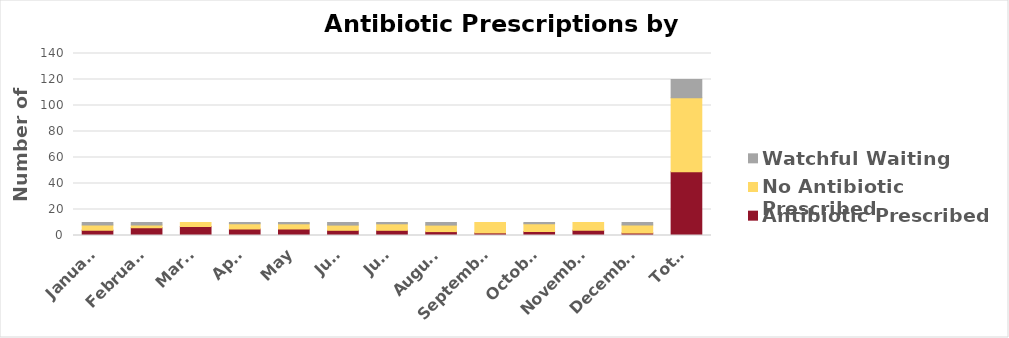
| Category | Antibiotic Prescribed | No Antibiotic Prescribed | Watchful Waiting |
|---|---|---|---|
| January | 4 | 4 | 2 |
| February | 6 | 2 | 2 |
| March | 7 | 3 | 0 |
| April | 5 | 4 | 1 |
| May | 5 | 4 | 1 |
| June | 4 | 4 | 2 |
| July | 4 | 5 | 1 |
| August | 3 | 5 | 2 |
| September | 2 | 8 | 0 |
| October | 3 | 6 | 1 |
| November | 4 | 6 | 0 |
| December  | 2 | 6 | 2 |
| Total  | 49 | 57 | 14 |